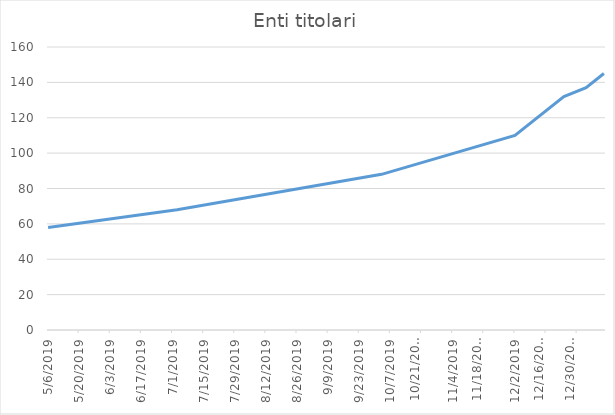
| Category | Enti titolari |
|---|---|
| 5/6/19 | 58 |
| 7/3/19 | 68 |
| 10/3/19 | 88 |
| 12/2/19 | 110 |
| 12/24/19 | 132 |
| 1/3/20 | 137 |
| 1/11/20 | 145 |